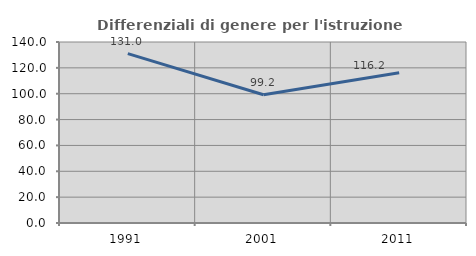
| Category | Differenziali di genere per l'istruzione superiore |
|---|---|
| 1991.0 | 131 |
| 2001.0 | 99.242 |
| 2011.0 | 116.206 |